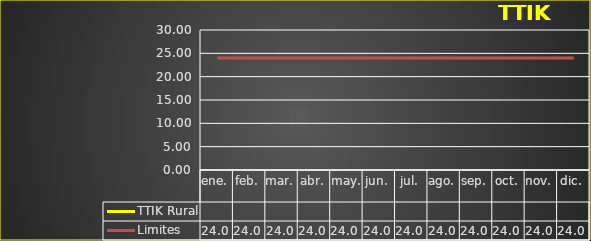
| Category | TTIK Rural | Limites |
|---|---|---|
| ene. |  | 24 |
| feb. |  | 24 |
| mar. |  | 24 |
| abr. |  | 24 |
| may. |  | 24 |
| jun. |  | 24 |
| jul. |  | 24 |
| ago. |  | 24 |
| sep. |  | 24 |
| oct. |  | 24 |
| nov. |  | 24 |
| dic. |  | 24 |